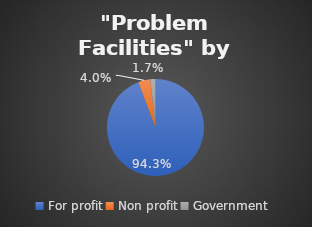
| Category | Series 0 |
|---|---|
| For profit | 0.943 |
| Non profit | 0.04 |
| Government | 0.017 |